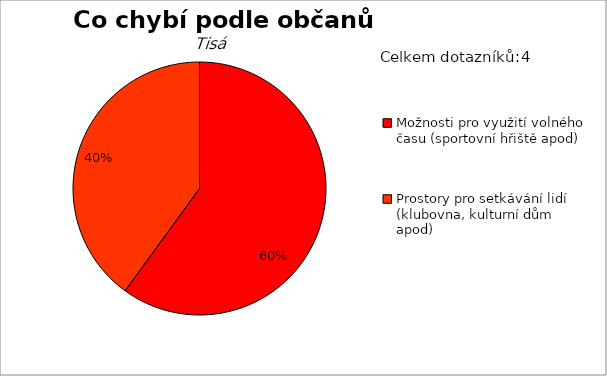
| Category | Series 0 |
|---|---|
| Možnosti pro využití volného času (sportovní hřiště apod) | 3 |
| Prostory pro setkávání lidí (klubovna, kulturní dům apod) | 2 |